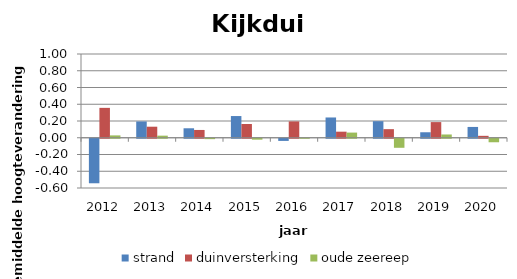
| Category | strand | duinversterking | oude zeereep |
|---|---|---|---|
| 2012.0 | -0.532 | 0.357 | 0.028 |
| 2013.0 | 0.195 | 0.132 | 0.025 |
| 2014.0 | 0.113 | 0.093 | -0.005 |
| 2015.0 | 0.259 | 0.164 | -0.011 |
| 2016.0 | -0.026 | 0.195 | 0.002 |
| 2017.0 | 0.242 | 0.072 | 0.062 |
| 2018.0 | 0.198 | 0.103 | -0.108 |
| 2019.0 | 0.066 | 0.187 | 0.039 |
| 2020.0 | 0.129 | 0.023 | -0.042 |